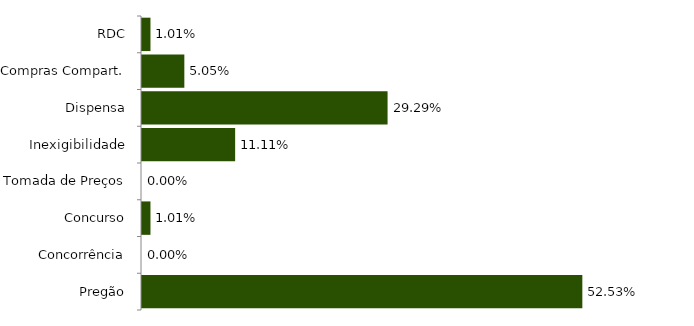
| Category | Series 0 |
|---|---|
| Pregão | 0.525 |
| Concorrência | 0 |
| Concurso | 0.01 |
| Tomada de Preços | 0 |
| Inexigibilidade | 0.111 |
| Dispensa | 0.293 |
| Compras Compart. | 0.051 |
| RDC | 0.01 |